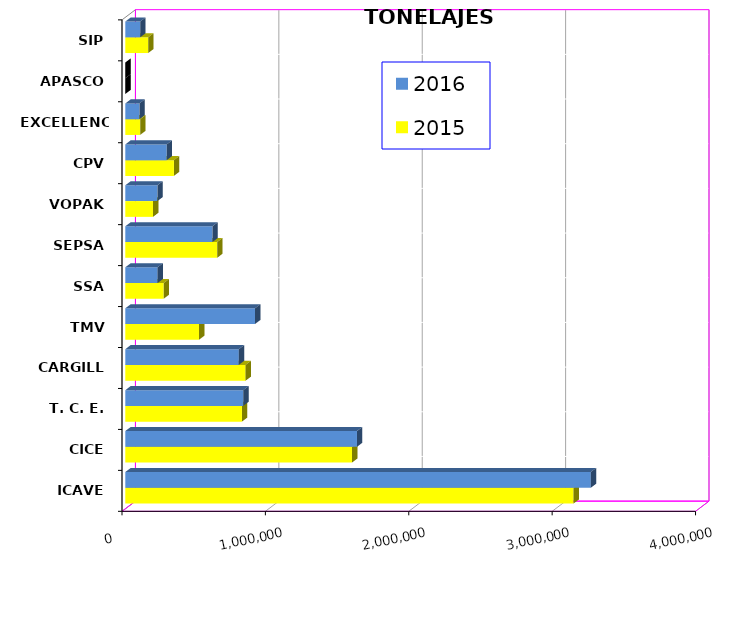
| Category | 2015 | 2016 |
|---|---|---|
| ICAVE | 3126365.132 | 3246589.4 |
| CICE | 1580989.348 | 1615676.518 |
| T. C. E. | 813426.262 | 822586.409 |
| CARGILL | 839041.2 | 791681.651 |
| TMV | 514218.223 | 904879.955 |
| SSA | 267461.425 | 225380.578 |
| SEPSA | 640592.27 | 607684.324 |
| VOPAK | 193259.279 | 223787.874 |
| CPV | 339039.83 | 288782.206 |
| EXCELLENCE | 103364.78 | 98179.957 |
| APASCO | 0 | 0 |
| SIP | 159795.22 | 104055.34 |